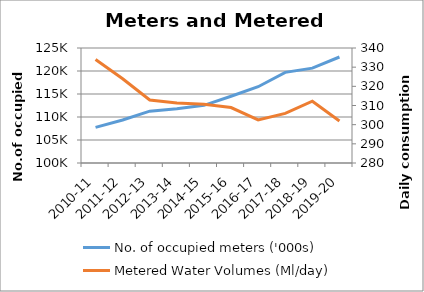
| Category | No. of occupied meters ('000s) |
|---|---|
| 2010-11 | 107.751 |
| 2011-12 | 109.344 |
| 2012-13 | 111.262 |
| 2013-14 | 111.814 |
| 2014-15 | 112.54 |
| 2015-16 | 114.518 |
| 2016-17 | 116.577 |
| 2017-18 | 119.706 |
| 2018-19 | 120.625 |
| 2019-20 | 123.045 |